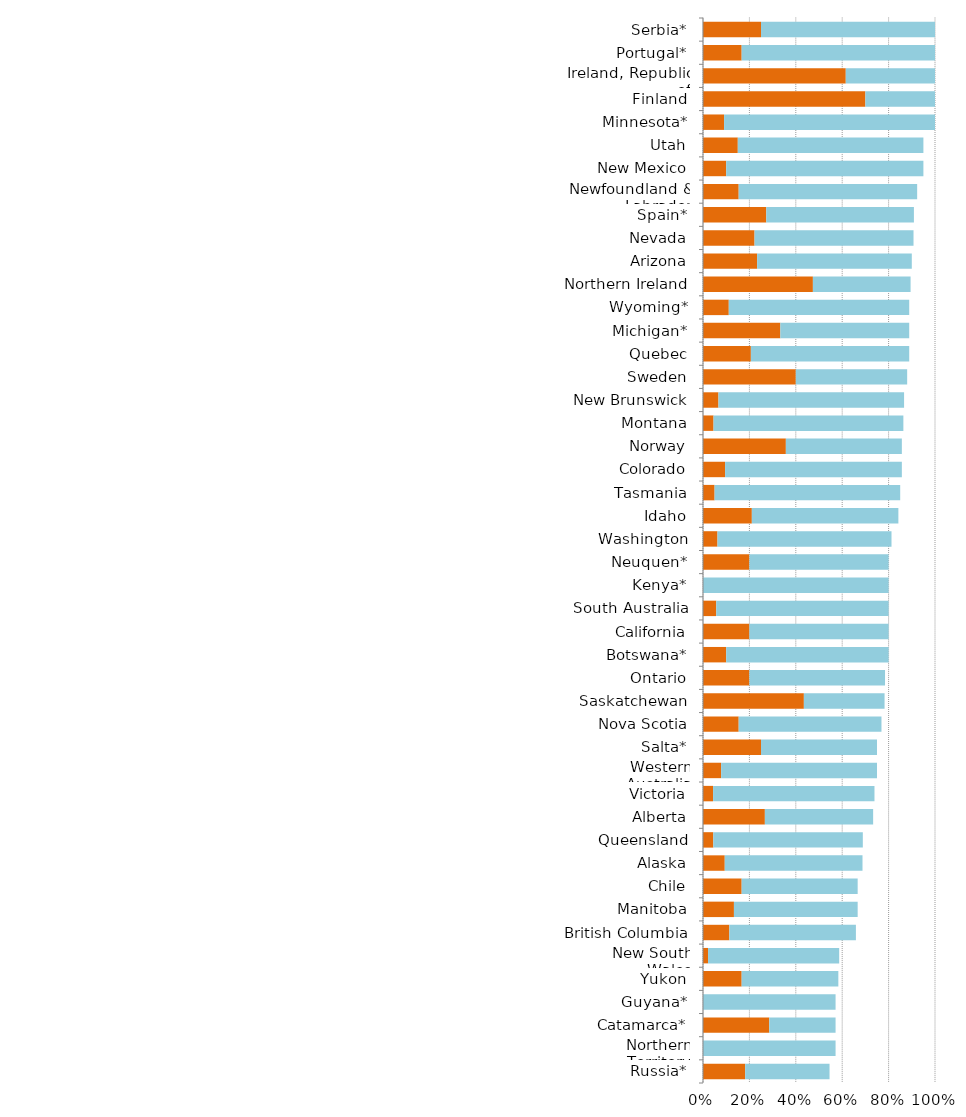
| Category | Series 0 | Series 1 |
|---|---|---|
| Russia* | 0.182 | 0.364 |
| Northern Territory | 0 | 0.571 |
| Catamarca* | 0.286 | 0.286 |
| Guyana* | 0 | 0.571 |
| Yukon | 0.167 | 0.417 |
| New South Wales | 0.022 | 0.565 |
| British Columbia | 0.114 | 0.545 |
| Manitoba | 0.133 | 0.533 |
| Chile | 0.167 | 0.5 |
| Alaska | 0.094 | 0.594 |
| Queensland | 0.044 | 0.644 |
| Alberta | 0.267 | 0.467 |
| Victoria | 0.043 | 0.696 |
| Western Australia | 0.078 | 0.672 |
| Salta* | 0.25 | 0.5 |
| Nova Scotia | 0.154 | 0.615 |
| Saskatchewan | 0.435 | 0.348 |
| Ontario | 0.2 | 0.585 |
| Botswana* | 0.1 | 0.7 |
| California | 0.2 | 0.6 |
| South Australia | 0.057 | 0.743 |
| Kenya* | 0 | 0.8 |
| Neuquen* | 0.2 | 0.6 |
| Washington | 0.062 | 0.75 |
| Idaho | 0.211 | 0.632 |
| Tasmania | 0.05 | 0.8 |
| Colorado | 0.095 | 0.762 |
| Norway | 0.357 | 0.5 |
| Montana | 0.045 | 0.818 |
| New Brunswick | 0.067 | 0.8 |
| Sweden | 0.4 | 0.48 |
| Quebec | 0.206 | 0.683 |
| Michigan* | 0.333 | 0.556 |
| Wyoming* | 0.111 | 0.778 |
| Northern Ireland | 0.474 | 0.421 |
| Arizona | 0.233 | 0.667 |
| Nevada | 0.222 | 0.685 |
| Spain* | 0.273 | 0.636 |
| Newfoundland & Labrador | 0.154 | 0.769 |
| New Mexico | 0.1 | 0.85 |
| Utah | 0.15 | 0.8 |
| Minnesota* | 0.091 | 0.909 |
| Finland | 0.7 | 0.3 |
| Ireland, Republic of | 0.615 | 0.385 |
| Portugal* | 0.167 | 0.833 |
| Serbia* | 0.25 | 0.75 |